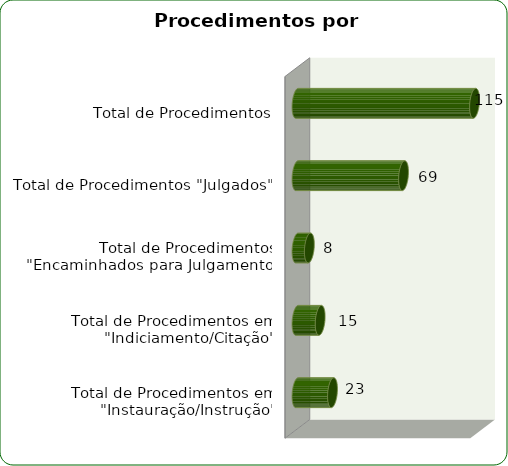
| Category | Série |
|---|---|
| Total de Procedimentos em "Instauração/Instrução" | 23 |
| Total de Procedimentos em "Indiciamento/Citação" | 15 |
| Total de Procedimentos "Encaminhados para Julgamento" | 8 |
| Total de Procedimentos "Julgados" | 69 |
| Total de Procedimentos | 115 |